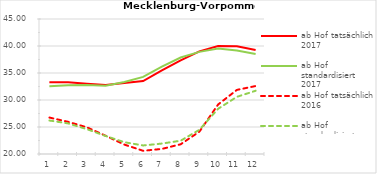
| Category | ab Hof tatsächlich 2017 | ab Hof standardisiert 2017 | ab Hof tatsächlich 2016 | ab Hof standardisiert 2016 |
|---|---|---|---|---|
| 0 | 33.299 | 32.534 | 26.749 | 26.202 |
| 1 | 33.299 | 32.729 | 25.96 | 25.662 |
| 2 | 33.031 | 32.778 | 24.939 | 24.604 |
| 3 | 32.771 | 32.66 | 23.381 | 23.335 |
| 4 | 33.138 | 33.337 | 21.745 | 22.183 |
| 5 | 33.497 | 34.271 | 20.59 | 21.582 |
| 6 | 35.493 | 36.197 | 20.94 | 21.932 |
| 7 | 37.357 | 37.872 | 21.798 | 22.463 |
| 8 | 39.004 | 38.913 | 24.138 | 24.479 |
| 9 | 39.992 | 39.546 | 29.168 | 28.372 |
| 10 | 39.934 | 39.168 | 31.869 | 30.585 |
| 11 | 39.24 | 38.53 | 32.587 | 31.712 |